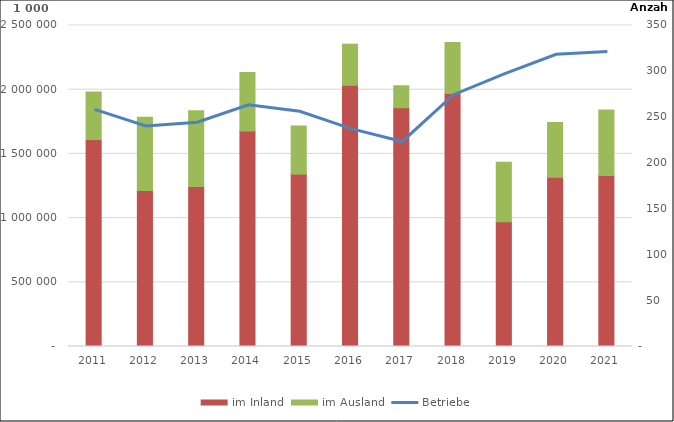
| Category | im Inland | im Ausland |
|---|---|---|
| 2011 | 1611545.985 | 370336.262 |
| 2012 | 1215603.362 | 569341.307 |
| 2013 | 1246830.08 | 589126.518 |
| 2014 | 1678439.11 | 455588.223 |
| 2015 | 1342701.236 | 374789.259 |
| 2016 | 2034299.972 | 320235.333 |
| 2017 | 1859552.818 | 171124.426 |
| 2018 | 1971074.968 | 396590.95 |
| 2019 | 971145.392 | 464737.795 |
| 2020 | 1318282.098 | 426147.164 |
| 2021 | 1332253.618 | 510389.869 |